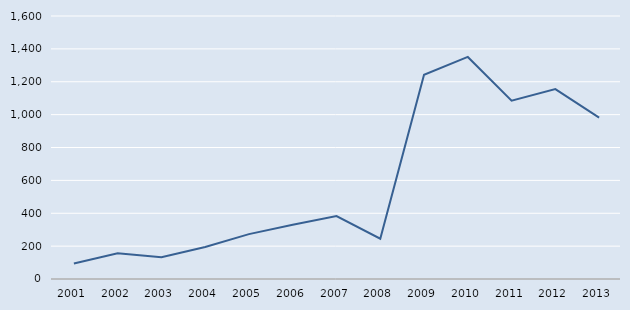
| Category | Series 0 |
|---|---|
| 2001.0 | 94 |
| 2002.0 | 157 |
| 2003.0 | 132 |
| 2004.0 | 195 |
| 2005.0 | 273 |
| 2006.0 | 330 |
| 2007.0 | 383 |
| 2008.0 | 245 |
| 2009.0 | 1242 |
| 2010.0 | 1351 |
| 2011.0 | 1085 |
| 2012.0 | 1155 |
| 2013.0 | 982 |